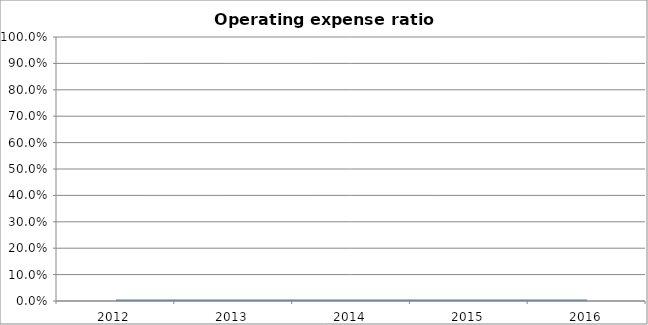
| Category | Operating expense ratio [(H-I-K-L)/H] |
|---|---|
| 2012.0 | 0 |
| 2013.0 | 0 |
| 2014.0 | 0 |
| 2015.0 | 0 |
| 2016.0 | 0 |